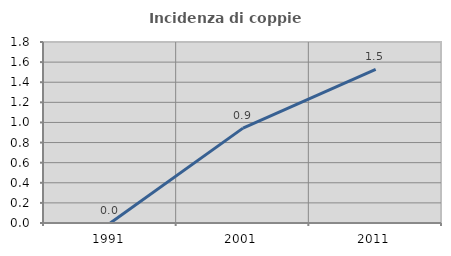
| Category | Incidenza di coppie miste |
|---|---|
| 1991.0 | 0 |
| 2001.0 | 0.943 |
| 2011.0 | 1.527 |